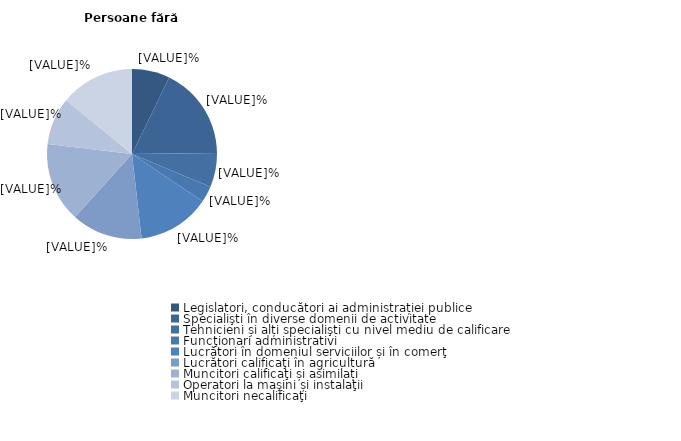
| Category | Persoane fără dizabilități |
|---|---|
| Legislatori, conducători ai administrației publice | 7.2 |
| Specialişti în diverse domenii de activitate | 17.6 |
| Tehnicieni și alți specialişti cu nivel mediu de calificare | 6.5 |
| Funcţionari administrativi | 3.1 |
| Lucrători în domeniul serviciilor și în comerţ | 13.8 |
| Lucrători calificaţi în agricultură | 13.5 |
| Muncitori calificaţi și asimilați | 15.2 |
| Operatori la maşini și instalaţii | 9 |
| Muncitori necalificaţi | 14.1 |